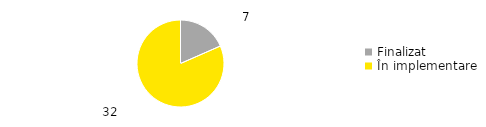
| Category | Total |
|---|---|
| Finalizat | 0.184 |
| În implementare | 0.816 |